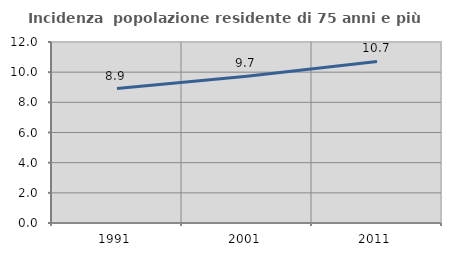
| Category | Incidenza  popolazione residente di 75 anni e più |
|---|---|
| 1991.0 | 8.913 |
| 2001.0 | 9.728 |
| 2011.0 | 10.711 |